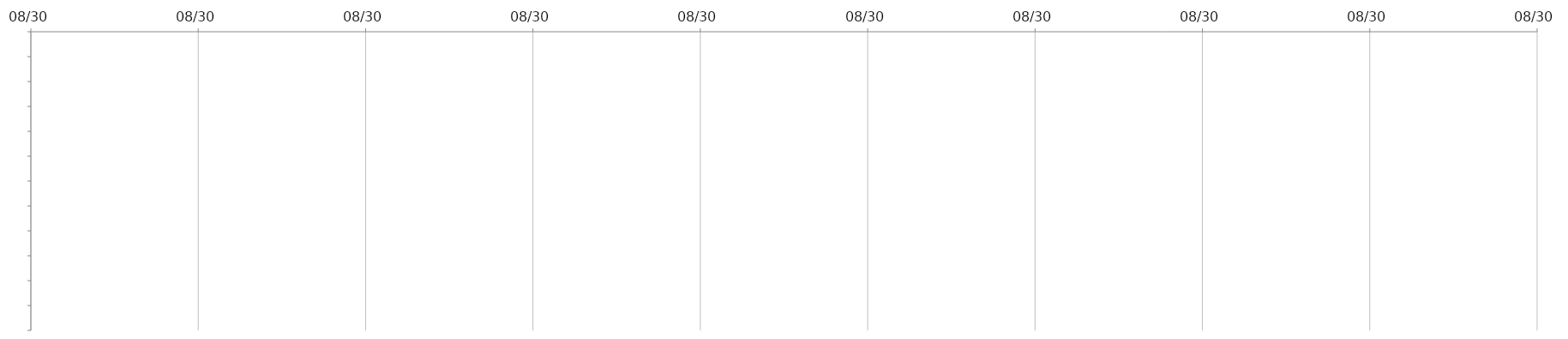
| Category | ANFANG | TAGE |
|---|---|---|
|  |  | 0 |
|  |  | 0 |
|  |  | 0 |
|  |  | 0 |
|  |  | 0 |
|  |  | 0 |
|  |  | 0 |
|  |  | 0 |
|  |  | 0 |
|  |  | 0 |
|  |  | 0 |
|  |  | 0 |